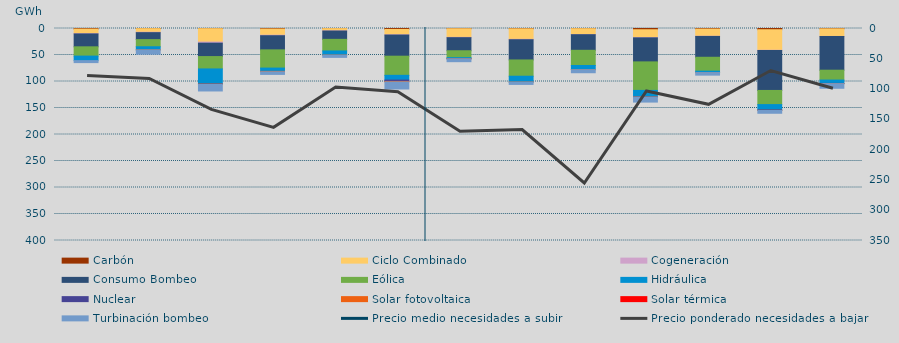
| Category | Carbón | Ciclo Combinado | Cogeneración | Consumo Bombeo | Eólica | Hidráulica | Nuclear | Solar fotovoltaica | Solar térmica | Turbinación bombeo |
|---|---|---|---|---|---|---|---|---|---|---|
| 0 | 1086 | 8544.1 | 632.1 | 24300.1 | 17519.3 | 8524.2 | 0 | 0 | 0 | 3741.6 |
| 1 | 269 | 6775.2 | 801.3 | 13110.1 | 13483.2 | 5930 | 0 | 58 | 0 | 8083.8 |
| 2 | 301 | 25336.5 | 2018 | 25298.1 | 23328.3 | 28317.4 | 441 | 400.1 | 0 | 12441 |
| 3 | 986.1 | 11670.3 | 960.4 | 26699.8 | 34355.5 | 6189.5 | 0 | 824.2 | 0 | 4935.4 |
| 4 | 189.6 | 4322.2 | 260 | 15706.7 | 21872.4 | 7879.7 | 0 | 145 | 0 | 4127.7 |
| 5 | 1762.4 | 10092.7 | 511 | 39879.1 | 36105.2 | 8975.5 | 2589.8 | 902 | 0 | 13286.1 |
| 6 | 431.9 | 16303.5 | 603.6 | 24652 | 12996.3 | 2005.4 | 25 | 151.9 | 0 | 5443.1 |
| 7 | 587 | 19880.3 | 745.7 | 38129.4 | 30707.4 | 11038.8 | 0 | 83.9 | 0 | 4346.7 |
| 8 | 318.1 | 10959 | 432 | 29416 | 28648.7 | 7863.5 | 0 | 105 | 0 | 5723.9 |
| 9 | 2349.7 | 14809.8 | 513.2 | 45318.9 | 53811.9 | 12435.2 | 162.7 | 147 | 0 | 9302.2 |
| 10 | 1032.05 | 13586.525 | 372.15 | 39287.3 | 26177.05 | 2674.925 | 0 | 91.5 | 0 | 4779.4 |
| 11 | 2338.05 | 38734.9 | 425.275 | 75366.15 | 26713.775 | 10087.325 | 758.925 | 314.05 | 0 | 5208.05 |
| 12 | 607 | 14346.825 | 84.1 | 63631.75 | 18608.375 | 6324.8 | 376.5 | 124.625 | 0 | 8670.125 |